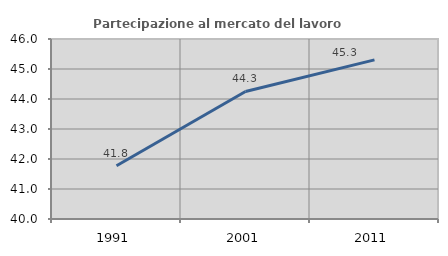
| Category | Partecipazione al mercato del lavoro  femminile |
|---|---|
| 1991.0 | 41.774 |
| 2001.0 | 44.251 |
| 2011.0 | 45.303 |